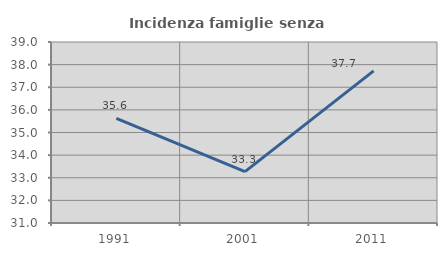
| Category | Incidenza famiglie senza nuclei |
|---|---|
| 1991.0 | 35.624 |
| 2001.0 | 33.273 |
| 2011.0 | 37.724 |